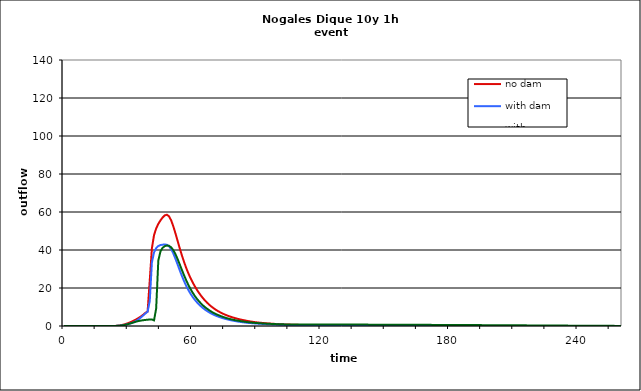
| Category | no dam | with dam | with dam/pond |
|---|---|---|---|
| 0.0 | 0 | 0 | 0 |
| 1.0 | 0 | 0 | 0 |
| 2.0 | 0 | 0 | 0 |
| 3.0 | 0 | 0 | 0 |
| 4.0 | 0 | 0 | 0 |
| 5.0 | 0 | 0 | 0 |
| 6.0 | 0 | 0 | 0 |
| 7.0 | 0 | 0 | 0 |
| 8.0 | 0 | 0 | 0 |
| 9.0 | 0 | 0 | 0 |
| 10.0 | 0 | 0 | 0 |
| 11.0 | 0 | 0 | 0 |
| 12.0 | 0 | 0 | 0 |
| 13.0 | 0 | 0 | 0 |
| 14.0 | 0 | 0 | 0 |
| 15.0 | 0 | 0 | 0 |
| 16.0 | 0 | 0 | 0 |
| 17.0 | 0 | 0 | 0 |
| 18.0 | 0 | 0 | 0 |
| 19.0 | 0 | 0 | 0 |
| 20.0 | 0 | 0 | 0 |
| 21.0 | 0 | 0 | 0 |
| 22.0 | 0.003 | 0.002 | 0.002 |
| 23.0 | 0.016 | 0.011 | 0.011 |
| 24.0 | 0.054 | 0.036 | 0.036 |
| 25.0 | 0.138 | 0.088 | 0.088 |
| 26.0 | 0.291 | 0.176 | 0.175 |
| 27.0 | 0.516 | 0.313 | 0.312 |
| 28.0 | 0.806 | 0.508 | 0.506 |
| 29.0 | 1.157 | 0.756 | 0.754 |
| 30.0 | 1.562 | 1.047 | 1.045 |
| 31.0 | 2.017 | 1.374 | 1.37 |
| 32.0 | 2.519 | 1.736 | 1.725 |
| 33.0 | 3.08 | 2.222 | 2.083 |
| 34.0 | 3.702 | 2.913 | 2.403 |
| 35.0 | 4.377 | 3.717 | 2.669 |
| 36.0 | 5.118 | 4.609 | 2.884 |
| 37.0 | 5.987 | 5.611 | 3.052 |
| 38.0 | 6.943 | 6.643 | 3.19 |
| 39.0 | 7.593 | 7.508 | 3.312 |
| 40.0 | 23.839 | 13.107 | 3.425 |
| 41.0 | 40.849 | 33.392 | 3.44 |
| 42.0 | 47.804 | 38.773 | 2.967 |
| 43.0 | 51.336 | 40.971 | 9.21 |
| 44.0 | 53.744 | 42.095 | 34.424 |
| 45.0 | 55.566 | 42.599 | 39.242 |
| 46.0 | 57.069 | 42.804 | 41.162 |
| 47.0 | 58.218 | 42.908 | 42.019 |
| 48.0 | 58.561 | 42.741 | 42.352 |
| 49.0 | 57.723 | 41.963 | 42.196 |
| 50.0 | 55.597 | 40.42 | 41.414 |
| 51.0 | 52.489 | 38.17 | 39.94 |
| 52.0 | 48.782 | 35.413 | 37.846 |
| 53.0 | 44.84 | 32.398 | 35.255 |
| 54.0 | 40.924 | 29.345 | 32.422 |
| 55.0 | 37.202 | 26.407 | 29.542 |
| 56.0 | 33.762 | 23.677 | 26.733 |
| 57.0 | 30.639 | 21.207 | 24.107 |
| 58.0 | 27.825 | 19.008 | 21.691 |
| 59.0 | 25.302 | 17.072 | 19.533 |
| 60.0 | 23.037 | 15.362 | 17.613 |
| 61.0 | 20.987 | 13.854 | 15.878 |
| 62.0 | 19.118 | 12.515 | 14.356 |
| 63.0 | 17.413 | 11.324 | 13.007 |
| 64.0 | 15.858 | 10.265 | 11.769 |
| 65.0 | 14.45 | 9.316 | 10.682 |
| 66.0 | 13.173 | 8.465 | 9.743 |
| 67.0 | 12.02 | 7.702 | 8.898 |
| 68.0 | 10.98 | 7.018 | 8.112 |
| 69.0 | 10.045 | 6.405 | 7.393 |
| 70.0 | 9.202 | 5.857 | 6.763 |
| 71.0 | 8.443 | 5.365 | 6.215 |
| 72.0 | 7.757 | 4.923 | 5.732 |
| 73.0 | 7.136 | 4.526 | 5.296 |
| 74.0 | 6.572 | 4.166 | 4.874 |
| 75.0 | 6.06 | 3.838 | 4.473 |
| 76.0 | 5.594 | 3.54 | 4.114 |
| 77.0 | 5.169 | 3.267 | 3.799 |
| 78.0 | 4.78 | 3.016 | 3.52 |
| 79.0 | 4.425 | 2.784 | 3.269 |
| 80.0 | 4.098 | 2.571 | 3.041 |
| 81.0 | 3.798 | 2.376 | 2.832 |
| 82.0 | 3.52 | 2.196 | 2.641 |
| 83.0 | 3.262 | 2.034 | 2.465 |
| 84.0 | 3.021 | 1.891 | 2.299 |
| 85.0 | 2.798 | 1.764 | 2.142 |
| 86.0 | 2.589 | 1.65 | 1.997 |
| 87.0 | 2.395 | 1.546 | 1.867 |
| 88.0 | 2.219 | 1.451 | 1.753 |
| 89.0 | 2.061 | 1.364 | 1.651 |
| 90.0 | 1.918 | 1.283 | 1.558 |
| 91.0 | 1.788 | 1.209 | 1.474 |
| 92.0 | 1.669 | 1.14 | 1.396 |
| 93.0 | 1.56 | 1.075 | 1.324 |
| 94.0 | 1.461 | 1.015 | 1.257 |
| 95.0 | 1.369 | 0.958 | 1.195 |
| 96.0 | 1.284 | 0.905 | 1.137 |
| 97.0 | 1.206 | 0.855 | 1.082 |
| 98.0 | 1.134 | 0.808 | 1.03 |
| 99.0 | 1.067 | 0.764 | 0.982 |
| 100.0 | 1.005 | 0.723 | 0.938 |
| 101.0 | 0.947 | 0.683 | 0.899 |
| 102.0 | 0.894 | 0.647 | 0.869 |
| 103.0 | 0.844 | 0.612 | 0.849 |
| 104.0 | 0.797 | 0.579 | 0.837 |
| 105.0 | 0.753 | 0.548 | 0.83 |
| 106.0 | 0.712 | 0.519 | 0.827 |
| 107.0 | 0.674 | 0.492 | 0.825 |
| 108.0 | 0.638 | 0.467 | 0.823 |
| 109.0 | 0.605 | 0.443 | 0.821 |
| 110.0 | 0.573 | 0.42 | 0.819 |
| 111.0 | 0.544 | 0.399 | 0.817 |
| 112.0 | 0.516 | 0.379 | 0.815 |
| 113.0 | 0.491 | 0.36 | 0.812 |
| 114.0 | 0.466 | 0.342 | 0.81 |
| 115.0 | 0.443 | 0.326 | 0.808 |
| 116.0 | 0.422 | 0.31 | 0.805 |
| 117.0 | 0.402 | 0.295 | 0.803 |
| 118.0 | 0.382 | 0.281 | 0.8 |
| 119.0 | 0.364 | 0.268 | 0.797 |
| 120.0 | 0.347 | 0.256 | 0.795 |
| 121.0 | 0.331 | 0.244 | 0.792 |
| 122.0 | 0.316 | 0.233 | 0.789 |
| 123.0 | 0.302 | 0.223 | 0.786 |
| 124.0 | 0.288 | 0.213 | 0.783 |
| 125.0 | 0.275 | 0.203 | 0.78 |
| 126.0 | 0.263 | 0.195 | 0.777 |
| 127.0 | 0.252 | 0.186 | 0.774 |
| 128.0 | 0.241 | 0.178 | 0.771 |
| 129.0 | 0.231 | 0.171 | 0.767 |
| 130.0 | 0.221 | 0.163 | 0.764 |
| 131.0 | 0.211 | 0.157 | 0.761 |
| 132.0 | 0.203 | 0.15 | 0.757 |
| 133.0 | 0.194 | 0.144 | 0.754 |
| 134.0 | 0.186 | 0.138 | 0.751 |
| 135.0 | 0.178 | 0.132 | 0.747 |
| 136.0 | 0.171 | 0.127 | 0.744 |
| 137.0 | 0.164 | 0.122 | 0.74 |
| 138.0 | 0.158 | 0.117 | 0.737 |
| 139.0 | 0.152 | 0.113 | 0.733 |
| 140.0 | 0.146 | 0.108 | 0.729 |
| 141.0 | 0.14 | 0.104 | 0.726 |
| 142.0 | 0.134 | 0.1 | 0.722 |
| 143.0 | 0.129 | 0.096 | 0.718 |
| 144.0 | 0.124 | 0.093 | 0.714 |
| 145.0 | 0.12 | 0.089 | 0.711 |
| 146.0 | 0.115 | 0.086 | 0.707 |
| 147.0 | 0.111 | 0.083 | 0.703 |
| 148.0 | 0.107 | 0.08 | 0.699 |
| 149.0 | 0.103 | 0.077 | 0.695 |
| 150.0 | 0.099 | 0.074 | 0.691 |
| 151.0 | 0.095 | 0.071 | 0.687 |
| 152.0 | 0.092 | 0.069 | 0.683 |
| 153.0 | 0.089 | 0.067 | 0.679 |
| 154.0 | 0.085 | 0.064 | 0.675 |
| 155.0 | 0.082 | 0.062 | 0.671 |
| 156.0 | 0.079 | 0.06 | 0.667 |
| 157.0 | 0.077 | 0.058 | 0.663 |
| 158.0 | 0.074 | 0.056 | 0.659 |
| 159.0 | 0.071 | 0.054 | 0.654 |
| 160.0 | 0.069 | 0.052 | 0.649 |
| 161.0 | 0.067 | 0.05 | 0.644 |
| 162.0 | 0.064 | 0.049 | 0.64 |
| 163.0 | 0.062 | 0.047 | 0.635 |
| 164.0 | 0.06 | 0.046 | 0.629 |
| 165.0 | 0.058 | 0.044 | 0.624 |
| 166.0 | 0.056 | 0.043 | 0.619 |
| 167.0 | 0.054 | 0.041 | 0.614 |
| 168.0 | 0.052 | 0.04 | 0.609 |
| 169.0 | 0.051 | 0.039 | 0.604 |
| 170.0 | 0.049 | 0.038 | 0.599 |
| 171.0 | 0.047 | 0.036 | 0.593 |
| 172.0 | 0.046 | 0.035 | 0.588 |
| 173.0 | 0.044 | 0.034 | 0.583 |
| 174.0 | 0.043 | 0.033 | 0.578 |
| 175.0 | 0.041 | 0.032 | 0.572 |
| 176.0 | 0.04 | 0.031 | 0.567 |
| 177.0 | 0.039 | 0.03 | 0.562 |
| 178.0 | 0.038 | 0.029 | 0.556 |
| 179.0 | 0.036 | 0.028 | 0.551 |
| 180.0 | 0.035 | 0.028 | 0.546 |
| 181.0 | 0.034 | 0.027 | 0.54 |
| 182.0 | 0.033 | 0.026 | 0.535 |
| 183.0 | 0.032 | 0.025 | 0.529 |
| 184.0 | 0.031 | 0.025 | 0.524 |
| 185.0 | 0.03 | 0.024 | 0.518 |
| 186.0 | 0.029 | 0.023 | 0.513 |
| 187.0 | 0.028 | 0.023 | 0.507 |
| 188.0 | 0.027 | 0.022 | 0.501 |
| 189.0 | 0.027 | 0.021 | 0.496 |
| 190.0 | 0.026 | 0.021 | 0.49 |
| 191.0 | 0.025 | 0.02 | 0.484 |
| 192.0 | 0.024 | 0.02 | 0.478 |
| 193.0 | 0.023 | 0.019 | 0.472 |
| 194.0 | 0.023 | 0.018 | 0.466 |
| 195.0 | 0.022 | 0.018 | 0.46 |
| 196.0 | 0.021 | 0.017 | 0.454 |
| 197.0 | 0.021 | 0.017 | 0.448 |
| 198.0 | 0.02 | 0.017 | 0.442 |
| 199.0 | 0.02 | 0.016 | 0.435 |
| 200.0 | 0.019 | 0.016 | 0.429 |
| 201.0 | 0.018 | 0.015 | 0.423 |
| 202.0 | 0.018 | 0.015 | 0.416 |
| 203.0 | 0.017 | 0.014 | 0.41 |
| 204.0 | 0.017 | 0.014 | 0.404 |
| 205.0 | 0.016 | 0.014 | 0.398 |
| 206.0 | 0.016 | 0.013 | 0.391 |
| 207.0 | 0.015 | 0.013 | 0.385 |
| 208.0 | 0.015 | 0.013 | 0.379 |
| 209.0 | 0.014 | 0.012 | 0.372 |
| 210.0 | 0.014 | 0.012 | 0.366 |
| 211.0 | 0.014 | 0.012 | 0.359 |
| 212.0 | 0.013 | 0.011 | 0.353 |
| 213.0 | 0.013 | 0.011 | 0.347 |
| 214.0 | 0.012 | 0.011 | 0.34 |
| 215.0 | 0.012 | 0.01 | 0.334 |
| 216.0 | 0.011 | 0.01 | 0.327 |
| 217.0 | 0.011 | 0.01 | 0.321 |
| 218.0 | 0.011 | 0.009 | 0.314 |
| 219.0 | 0.01 | 0.009 | 0.308 |
| 220.0 | 0.01 | 0.009 | 0.301 |
| 221.0 | 0.01 | 0.008 | 0.294 |
| 222.0 | 0.009 | 0.008 | 0.287 |
| 223.0 | 0.009 | 0.008 | 0.28 |
| 224.0 | 0.008 | 0.008 | 0.273 |
| 225.0 | 0.008 | 0.007 | 0.266 |
| 226.0 | 0.008 | 0.007 | 0.259 |
| 227.0 | 0.008 | 0.007 | 0.253 |
| 228.0 | 0.007 | 0.007 | 0.246 |
| 229.0 | 0.007 | 0.006 | 0.239 |
| 230.0 | 0.007 | 0.006 | 0.232 |
| 231.0 | 0.006 | 0.006 | 0.225 |
| 232.0 | 0.006 | 0.006 | 0.219 |
| 233.0 | 0.006 | 0.005 | 0.212 |
| 234.0 | 0.005 | 0.005 | 0.206 |
| 235.0 | 0.005 | 0.005 | 0.199 |
| 236.0 | 0.005 | 0.005 | 0.193 |
| 237.0 | 0.005 | 0.005 | 0.186 |
| 238.0 | 0.004 | 0.004 | 0.18 |
| 239.0 | 0.004 | 0.004 | 0.173 |
| 240.0 | 0.004 | 0.004 | 0.167 |
| 241.0 | 0.004 | 0.004 | 0.16 |
| 242.0 | 0.003 | 0.004 | 0.153 |
| 243.0 | 0.003 | 0.003 | 0.146 |
| 244.0 | 0.003 | 0.003 | 0.139 |
| 245.0 | 0.003 | 0.003 | 0.132 |
| 246.0 | 0.003 | 0.003 | 0.125 |
| 247.0 | 0.002 | 0.003 | 0.118 |
| 248.0 | 0.002 | 0.003 | 0.111 |
| 249.0 | 0.002 | 0.002 | 0.105 |
| 250.0 | 0.002 | 0.002 | 0.099 |
| 251.0 | 0.002 | 0.002 | 0.093 |
| 252.0 | 0.002 | 0.002 | 0.087 |
| 253.0 | 0.001 | 0.002 | 0.082 |
| 254.0 | 0.001 | 0.002 | 0.077 |
| 255.0 | 0.001 | 0.002 | 0.073 |
| 256.0 | 0.001 | 0.001 | 0.068 |
| 257.0 | 0.001 | 0.001 | 0.064 |
| 258.0 | 0.001 | 0.001 | 0.061 |
| 259.0 | 0.001 | 0.001 | 0.057 |
| 260.0 | 0.001 | 0.001 | 0.054 |